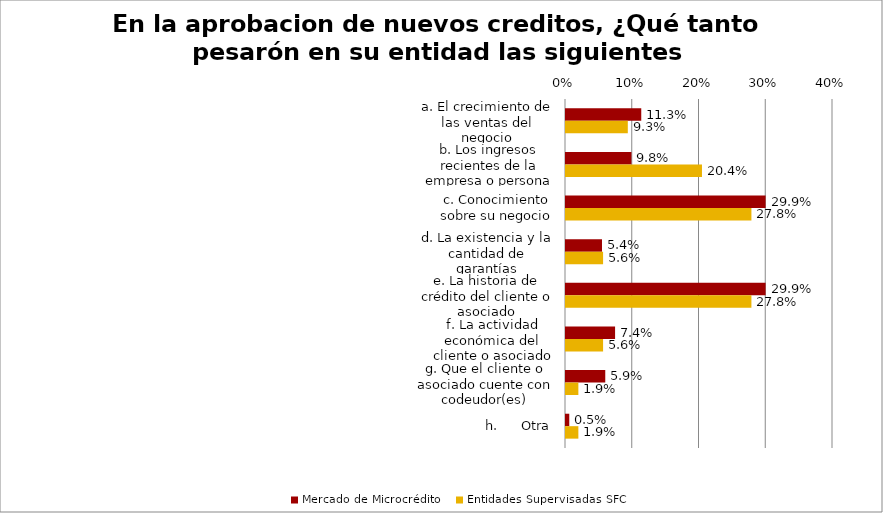
| Category | Mercado de Microcrédito | Entidades Supervisadas SFC |
|---|---|---|
| a. El crecimiento de las ventas del negocio | 0.113 | 0.093 |
| b. Los ingresos recientes de la empresa o persona natural | 0.098 | 0.204 |
| c. Conocimiento sobre su negocio | 0.299 | 0.278 |
| d. La existencia y la cantidad de garantías | 0.054 | 0.056 |
| e. La historia de crédito del cliente o asociado | 0.299 | 0.278 |
| f. La actividad económica del cliente o asociado | 0.074 | 0.056 |
| g. Que el cliente o asociado cuente con codeudor(es) | 0.059 | 0.019 |
| h.      Otra | 0.005 | 0.019 |